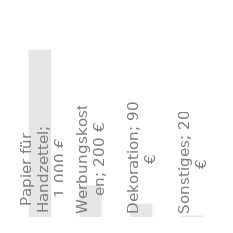
| Category | Jahresausgaben |
|---|---|
| Papier für Handzettel | 1000 |
| Werbungskosten | 200 |
| Dekoration | 90 |
| Sonstiges | 20 |